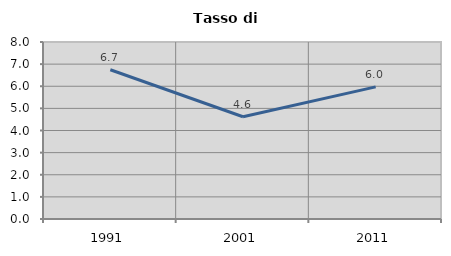
| Category | Tasso di disoccupazione   |
|---|---|
| 1991.0 | 6.746 |
| 2001.0 | 4.62 |
| 2011.0 | 5.973 |